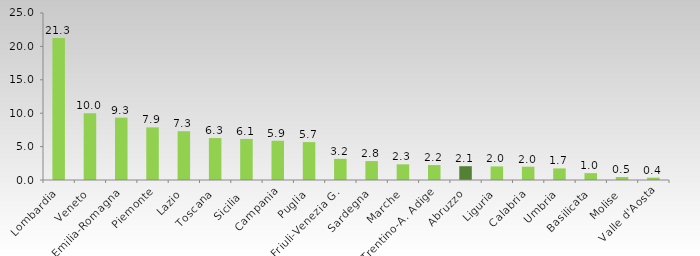
| Category | Series 0 |
|---|---|
| Lombardia | 21.27 |
| Veneto | 9.978 |
| Emilia-Romagna | 9.34 |
| Piemonte | 7.881 |
| Lazio | 7.302 |
| Toscana | 6.279 |
| Sicilia  | 6.147 |
| Campania | 5.877 |
| Puglia | 5.676 |
| Friuli-Venezia G. | 3.168 |
| Sardegna | 2.832 |
| Marche | 2.347 |
| Trentino-A. Adige | 2.241 |
| Abruzzo | 2.066 |
| Liguria | 2.034 |
| Calabria | 1.989 |
| Umbria | 1.735 |
| Basilicata | 1.028 |
| Molise | 0.453 |
| Valle d'Aosta | 0.355 |